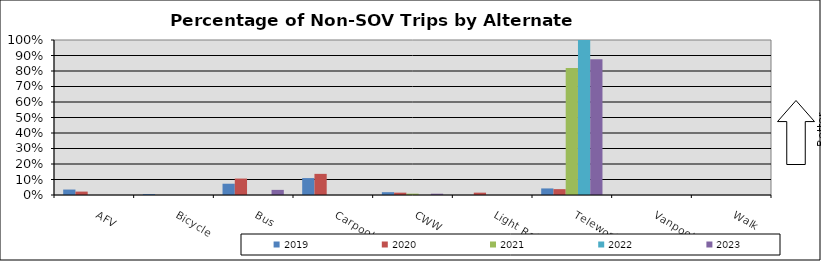
| Category | 2019 | 2020 | 2021 | 2022 | 2023 |
|---|---|---|---|---|---|
| AFV | 0.035 | 0.022 | 0 | 0 | 0 |
| Bicycle | 0.006 | 0 | 0 | 0 | 0 |
| Bus | 0.073 | 0.106 | 0 | 0 | 0.033 |
| Carpool | 0.109 | 0.136 | 0 | 0 | 0 |
| CWW | 0.018 | 0.015 | 0.009 | 0 | 0.008 |
| Light Rail | 0 | 0.015 | 0 | 0 | 0 |
| Telework | 0.042 | 0.038 | 0.819 | 1 | 0.876 |
| Vanpool | 0 | 0 | 0 | 0 | 0 |
| Walk | 0 | 0 | 0 | 0 | 0 |